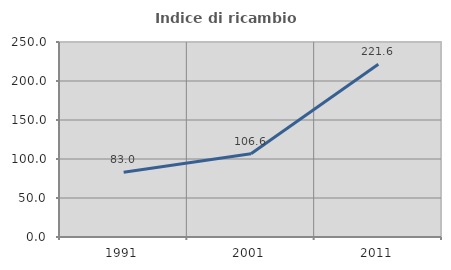
| Category | Indice di ricambio occupazionale  |
|---|---|
| 1991.0 | 83 |
| 2001.0 | 106.618 |
| 2011.0 | 221.569 |